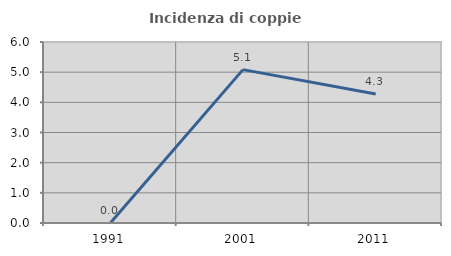
| Category | Incidenza di coppie miste |
|---|---|
| 1991.0 | 0 |
| 2001.0 | 5.085 |
| 2011.0 | 4.274 |